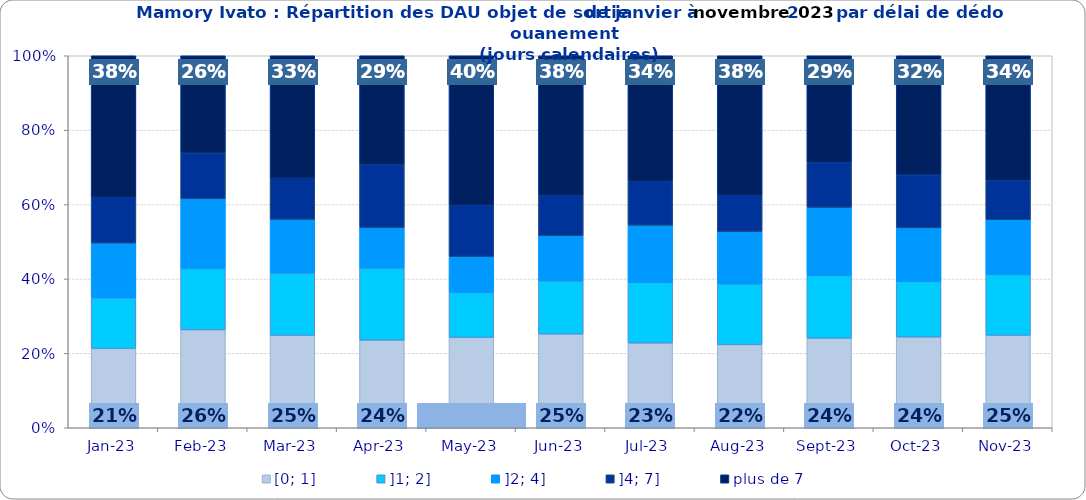
| Category | [0; 1] | ]1; 2] | ]2; 4] | ]4; 7] | plus de 7 |
|---|---|---|---|---|---|
| 2023-01-01 | 0.213 | 0.136 | 0.148 | 0.123 | 0.38 |
| 2023-02-01 | 0.263 | 0.165 | 0.187 | 0.123 | 0.261 |
| 2023-03-01 | 0.248 | 0.168 | 0.145 | 0.11 | 0.329 |
| 2023-04-01 | 0.235 | 0.194 | 0.109 | 0.169 | 0.293 |
| 2023-05-01 | 0.243 | 0.121 | 0.096 | 0.138 | 0.402 |
| 2023-06-01 | 0.252 | 0.143 | 0.122 | 0.108 | 0.376 |
| 2023-07-01 | 0.228 | 0.163 | 0.154 | 0.118 | 0.337 |
| 2023-08-01 | 0.223 | 0.163 | 0.141 | 0.098 | 0.375 |
| 2023-09-01 | 0.241 | 0.168 | 0.183 | 0.12 | 0.287 |
| 2023-10-01 | 0.244 | 0.149 | 0.144 | 0.143 | 0.32 |
| 2023-11-01 | 0.249 | 0.163 | 0.147 | 0.105 | 0.335 |